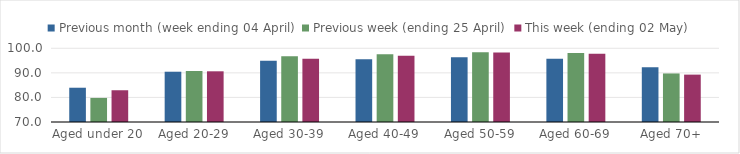
| Category | Previous month (week ending 04 April) | Previous week (ending 25 April) | This week (ending 02 May) |
|---|---|---|---|
| Aged under 20 | 83.949 | 79.8 | 82.922 |
| Aged 20-29 | 90.462 | 90.787 | 90.633 |
| Aged 30-39 | 94.887 | 96.712 | 95.746 |
| Aged 40-49 | 95.54 | 97.546 | 96.918 |
| Aged 50-59 | 96.4 | 98.423 | 98.254 |
| Aged 60-69 | 95.771 | 98.06 | 97.754 |
| Aged 70+ | 92.32 | 89.757 | 89.283 |